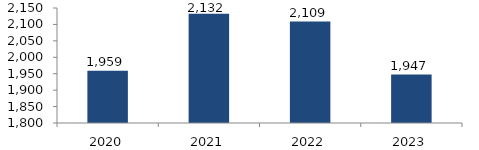
| Category | Bogotá |
|---|---|
| 2020.0 | 1958.647 |
| 2021.0 | 2132.193 |
| 2022.0 | 2108.667 |
| 2023.0 | 1947.266 |